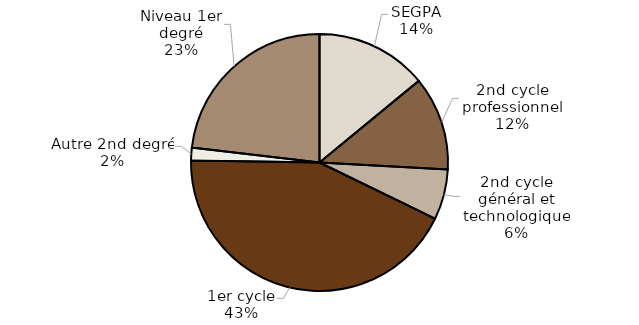
| Category | Series 0 |
|---|---|
| SEGPA | 795 |
| 2nd cycle professionnel | 669 |
| 2nd cycle général et technologique | 359 |
| 1er cycle | 2436 |
| Autre 2nd degré | 92 |
| Niveau 1er degré | 1310 |